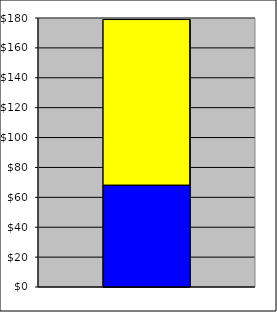
| Category | Series 0 | Series 1 |
|---|---|---|
| 0 | 68.22 | 110.74 |